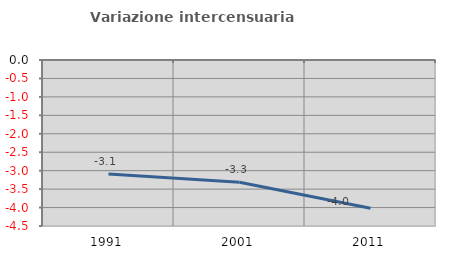
| Category | Variazione intercensuaria annua |
|---|---|
| 1991.0 | -3.088 |
| 2001.0 | -3.313 |
| 2011.0 | -4.018 |